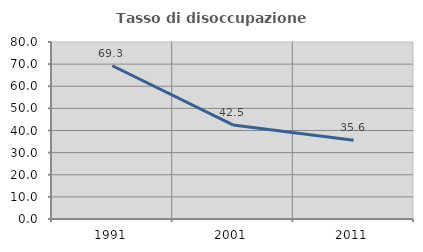
| Category | Tasso di disoccupazione giovanile  |
|---|---|
| 1991.0 | 69.274 |
| 2001.0 | 42.5 |
| 2011.0 | 35.556 |